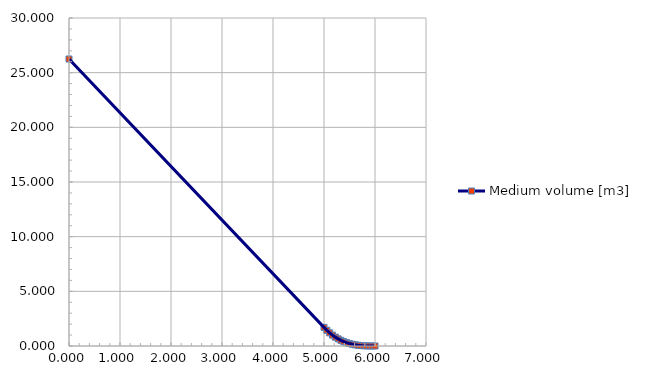
| Category | Medium volume [m3] |
|---|---|
| 0.0 | 26.248 |
| 5.0 | 1.704 |
| 5.056 | 1.439 |
| 5.111 | 1.203 |
| 5.167 | 0.995 |
| 5.222 | 0.811 |
| 5.278 | 0.652 |
| 5.333 | 0.516 |
| 5.389 | 0.399 |
| 5.444 | 0.302 |
| 5.5 | 0.222 |
| 5.556 | 0.158 |
| 5.611 | 0.107 |
| 5.667 | 0.069 |
| 5.722 | 0.041 |
| 5.778 | 0.022 |
| 5.833 | 0.01 |
| 5.889 | 0.003 |
| 5.944 | 0.001 |
| 6.0 | 0 |